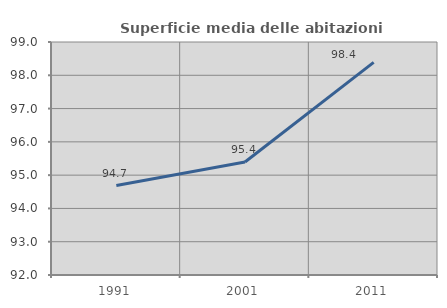
| Category | Superficie media delle abitazioni occupate |
|---|---|
| 1991.0 | 94.687 |
| 2001.0 | 95.396 |
| 2011.0 | 98.386 |